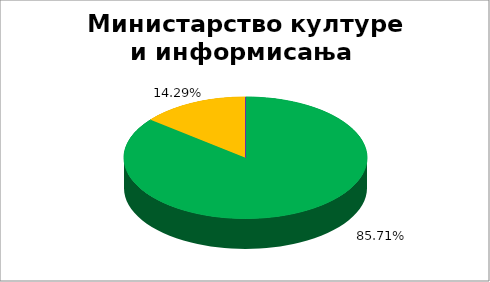
| Category | Министарство културе и информисања  |
|---|---|
| 0 | 0.857 |
| 1 | 0.143 |
| 2 | 0 |
| 3 | 0 |
| 4 | 0 |